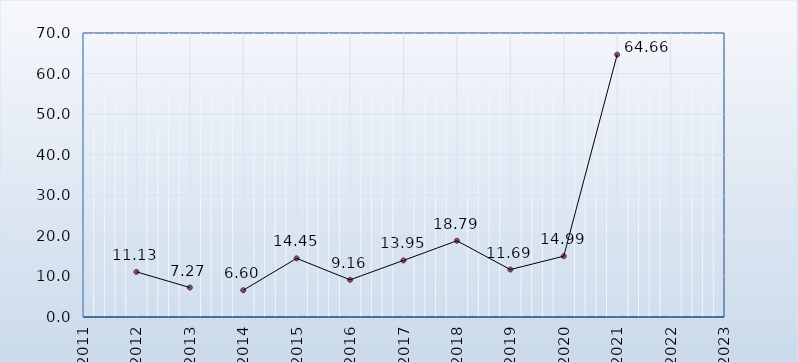
| Category | Series 0 |
|---|---|
| 2012.0 | 11.133 |
| 2013.0 | 7.266 |
| 2014.0 | 7.719 |
| 2015.0 | 6.6 |
| 2016.0 | 14.453 |
| 2017.0 | 9.164 |
| 2018.0 | 13.95 |
| 2019.0 | 18.793 |
| 2020.0 | 11.695 |
| 2021.0 | 14.993 |
| 2022.0 | 64.663 |